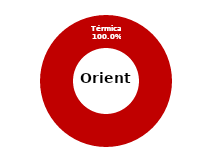
| Category | Oriente |
|---|---|
| Eólica | 0 |
| Hidráulica | 0 |
| Solar | 0 |
| Térmica | 34.416 |